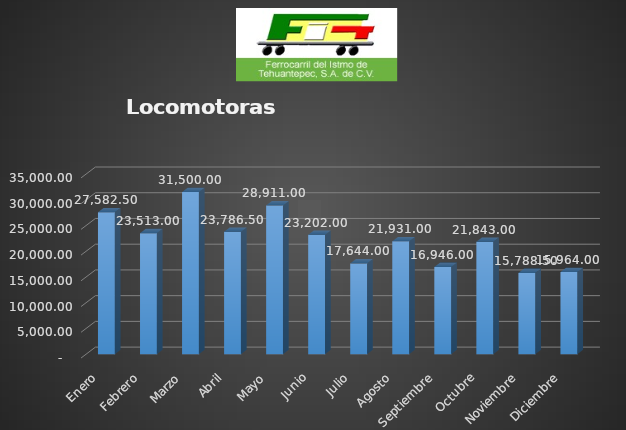
| Category | Series 0 |
|---|---|
| Enero | 27582.5 |
| Febrero | 23513 |
| Marzo | 31500 |
| Abril | 23786.5 |
| Mayo | 28911 |
| Junio | 23202 |
| Julio | 17644 |
| Agosto | 21931 |
| Septiembre | 16946 |
| Octubre | 21843 |
| Noviembre | 15788.5 |
| Diciembre | 15964 |